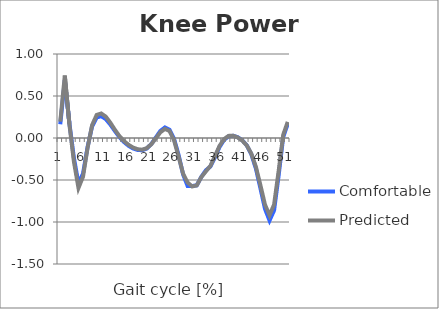
| Category | Comfortable | Predicted |
|---|---|---|
| 0 | 0.164 | 0.196 |
| 1 | 0.688 | 0.743 |
| 2 | 0.178 | 0.165 |
| 3 | -0.239 | -0.283 |
| 4 | -0.541 | -0.595 |
| 5 | -0.424 | -0.46 |
| 6 | -0.108 | -0.118 |
| 7 | 0.138 | 0.154 |
| 8 | 0.245 | 0.274 |
| 9 | 0.26 | 0.292 |
| 10 | 0.226 | 0.254 |
| 11 | 0.161 | 0.182 |
| 12 | 0.084 | 0.098 |
| 13 | 0.012 | 0.023 |
| 14 | -0.048 | -0.036 |
| 15 | -0.092 | -0.081 |
| 16 | -0.125 | -0.113 |
| 17 | -0.142 | -0.133 |
| 18 | -0.146 | -0.139 |
| 19 | -0.125 | -0.121 |
| 20 | -0.073 | -0.075 |
| 21 | 0.005 | -0.005 |
| 22 | 0.084 | 0.068 |
| 23 | 0.125 | 0.109 |
| 24 | 0.099 | 0.084 |
| 25 | -0.008 | -0.026 |
| 26 | -0.2 | -0.219 |
| 27 | -0.434 | -0.424 |
| 28 | -0.572 | -0.531 |
| 29 | -0.571 | -0.577 |
| 30 | -0.564 | -0.564 |
| 31 | -0.464 | -0.466 |
| 32 | -0.385 | -0.398 |
| 33 | -0.34 | -0.332 |
| 34 | -0.23 | -0.216 |
| 35 | -0.108 | -0.095 |
| 36 | -0.023 | -0.013 |
| 37 | 0.02 | 0.025 |
| 38 | 0.026 | 0.027 |
| 39 | 0.01 | 0.007 |
| 40 | -0.027 | -0.031 |
| 41 | -0.088 | -0.089 |
| 42 | -0.194 | -0.186 |
| 43 | -0.364 | -0.343 |
| 44 | -0.6 | -0.563 |
| 45 | -0.843 | -0.793 |
| 46 | -0.982 | -0.92 |
| 47 | -0.862 | -0.793 |
| 48 | -0.448 | -0.393 |
| 49 | 0.01 | 0.037 |
| 50 | 0.168 | 0.192 |